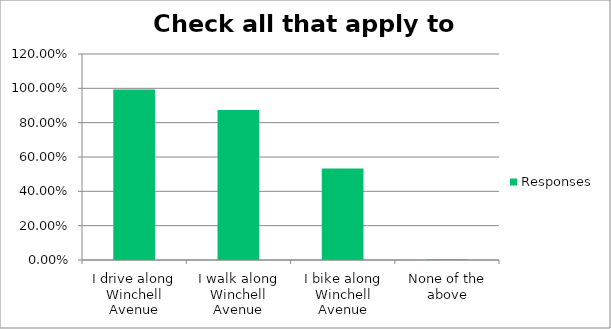
| Category | Responses |
|---|---|
| I drive along Winchell Avenue | 0.993 |
| I walk along Winchell Avenue | 0.874 |
| I bike along Winchell Avenue | 0.532 |
| None of the above | 0.003 |